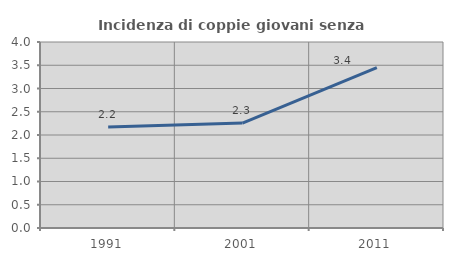
| Category | Incidenza di coppie giovani senza figli |
|---|---|
| 1991.0 | 2.174 |
| 2001.0 | 2.256 |
| 2011.0 | 3.448 |